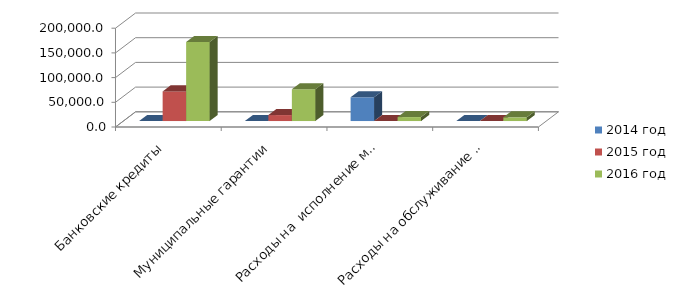
| Category | 2014 год | 2015 год | 2016 год |
|---|---|---|---|
| Банковские кредиты | 0 | 60000 | 160000 |
| Муниципальные гарантии | 0 | 12090 | 64350 |
| Расходы на  исполнение муниципальных гарантий | 48039.4 | 0 | 8007.9 |
| Расходы на обслуживание муниципального долга | 0 | 0 | 7472.8 |